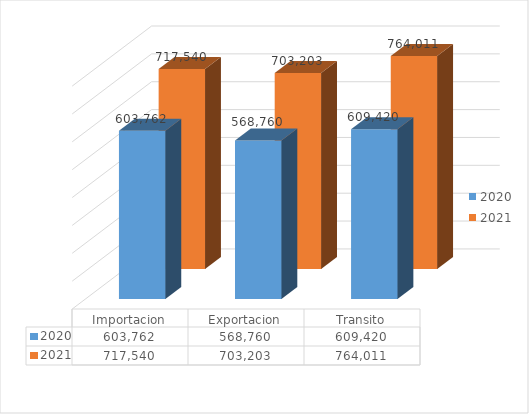
| Category | 2020 | 2021 |
|---|---|---|
| Importacion | 603762 | 717540 |
| Exportacion | 568760 | 703203 |
| Transito | 609420 | 764011 |